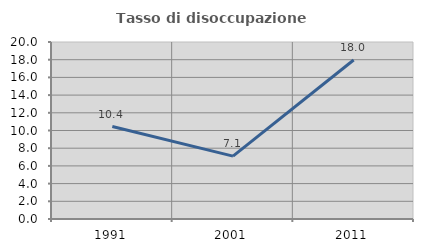
| Category | Tasso di disoccupazione giovanile  |
|---|---|
| 1991.0 | 10.448 |
| 2001.0 | 7.101 |
| 2011.0 | 17.961 |